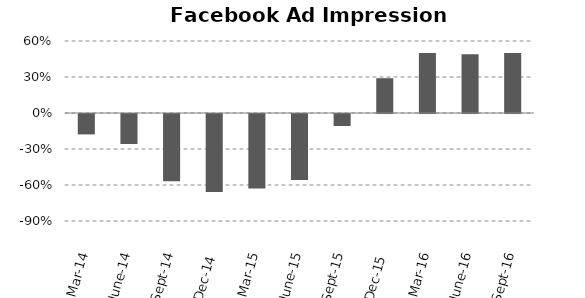
| Category | Growth in number of ad impressions (%, year-over-year) |
|---|---|
| Mar-14 | -0.17 |
| June-14 | -0.25 |
| Sept-14 | -0.56 |
| Dec-14 | -0.65 |
| Mar-15 | -0.62 |
| June-15 | -0.55 |
| Sept-15 | -0.1 |
| Dec-15 | 0.29 |
| Mar-16 | 0.5 |
| June-16 | 0.49 |
| Sept-16 | 0.5 |